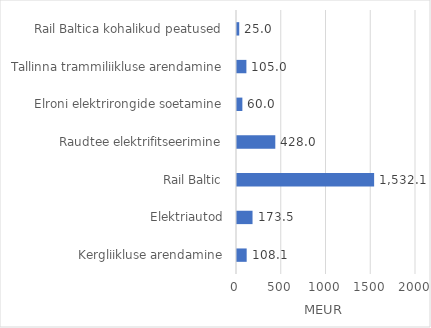
| Category | Series 0 |
|---|---|
| Kergliikluse arendamine | 108.148 |
| Elektriautod | 173.537 |
| Rail Baltic | 1532.142 |
| Raudtee elektrifitseerimine | 428 |
| Elroni elektrirongide soetamine | 60 |
| Tallinna trammiliikluse arendamine | 105 |
| Rail Baltica kohalikud peatused | 25 |